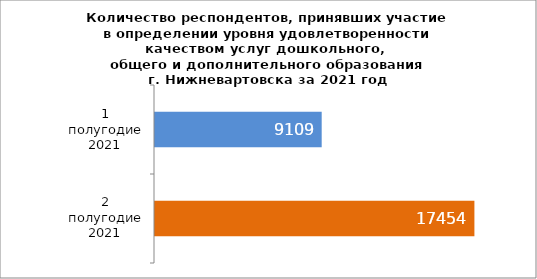
| Category | Series 0 |
|---|---|
| 1 полугодие 2021 | 9109 |
| 2 полугодие 2021 | 17454 |